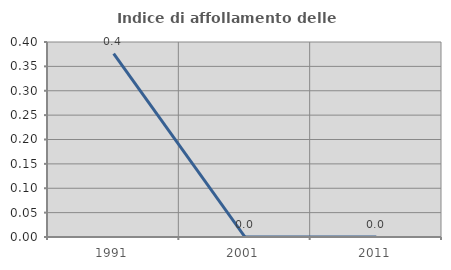
| Category | Indice di affollamento delle abitazioni  |
|---|---|
| 1991.0 | 0.376 |
| 2001.0 | 0 |
| 2011.0 | 0 |